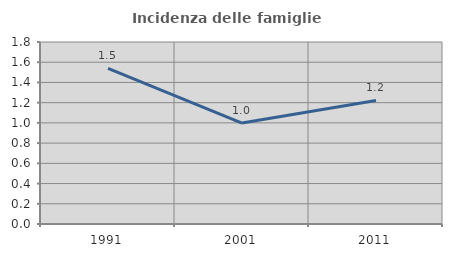
| Category | Incidenza delle famiglie numerose |
|---|---|
| 1991.0 | 1.538 |
| 2001.0 | 0.998 |
| 2011.0 | 1.222 |